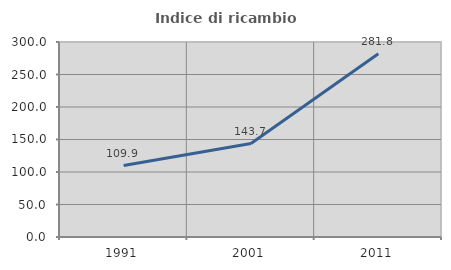
| Category | Indice di ricambio occupazionale  |
|---|---|
| 1991.0 | 109.866 |
| 2001.0 | 143.705 |
| 2011.0 | 281.847 |